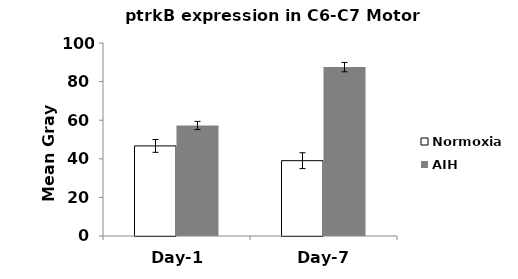
| Category | Normoxia | AIH |
|---|---|---|
| 0 | 46.677 | 57.258 |
| 1 | 39.03 | 87.509 |